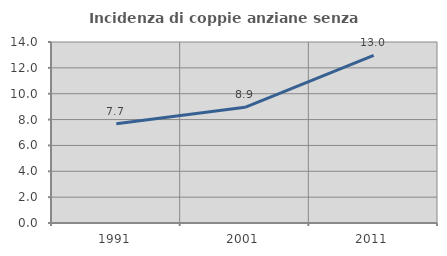
| Category | Incidenza di coppie anziane senza figli  |
|---|---|
| 1991.0 | 7.68 |
| 2001.0 | 8.947 |
| 2011.0 | 12.967 |